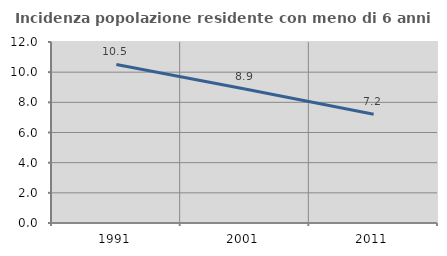
| Category | Incidenza popolazione residente con meno di 6 anni |
|---|---|
| 1991.0 | 10.512 |
| 2001.0 | 8.885 |
| 2011.0 | 7.211 |